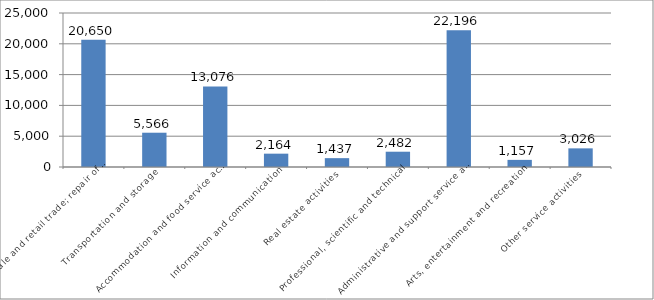
| Category |  Employees |
|---|---|
|  Wholesale and retail trade; repair of motor vehicles  | 20650.4 |
|  Transportation and storage  | 5565.6 |
|  Accommodation and food service activities  | 13076.2 |
|  Information and communication  | 2164.1 |
|  Real estate activities  | 1437.2 |
|  Professional, scientific and technical  | 2482 |
|  Administrative and support service acti  | 22196 |
|  Arts, entertainment and recreation  | 1157.2 |
|  Other service activities  | 3025.7 |